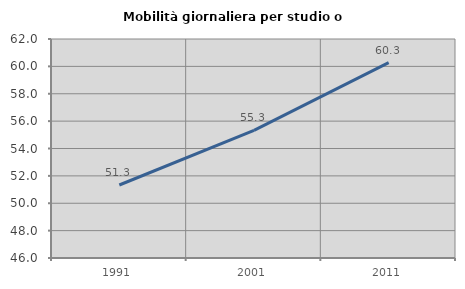
| Category | Mobilità giornaliera per studio o lavoro |
|---|---|
| 1991.0 | 51.333 |
| 2001.0 | 55.32 |
| 2011.0 | 60.275 |